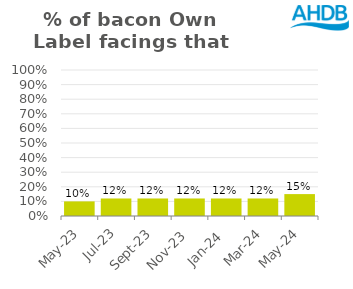
| Category | Bacon |
|---|---|
| 2023-05-01 | 0.1 |
| 2023-07-01 | 0.12 |
| 2023-09-01 | 0.12 |
| 2023-11-01 | 0.12 |
| 2024-01-01 | 0.12 |
| 2024-03-01 | 0.12 |
| 2024-05-01 | 0.15 |